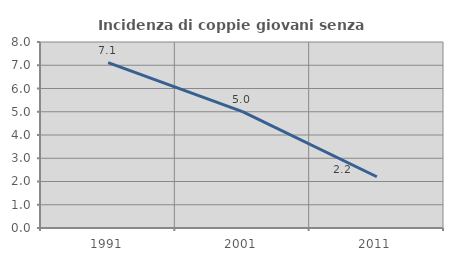
| Category | Incidenza di coppie giovani senza figli |
|---|---|
| 1991.0 | 7.115 |
| 2001.0 | 5.004 |
| 2011.0 | 2.204 |